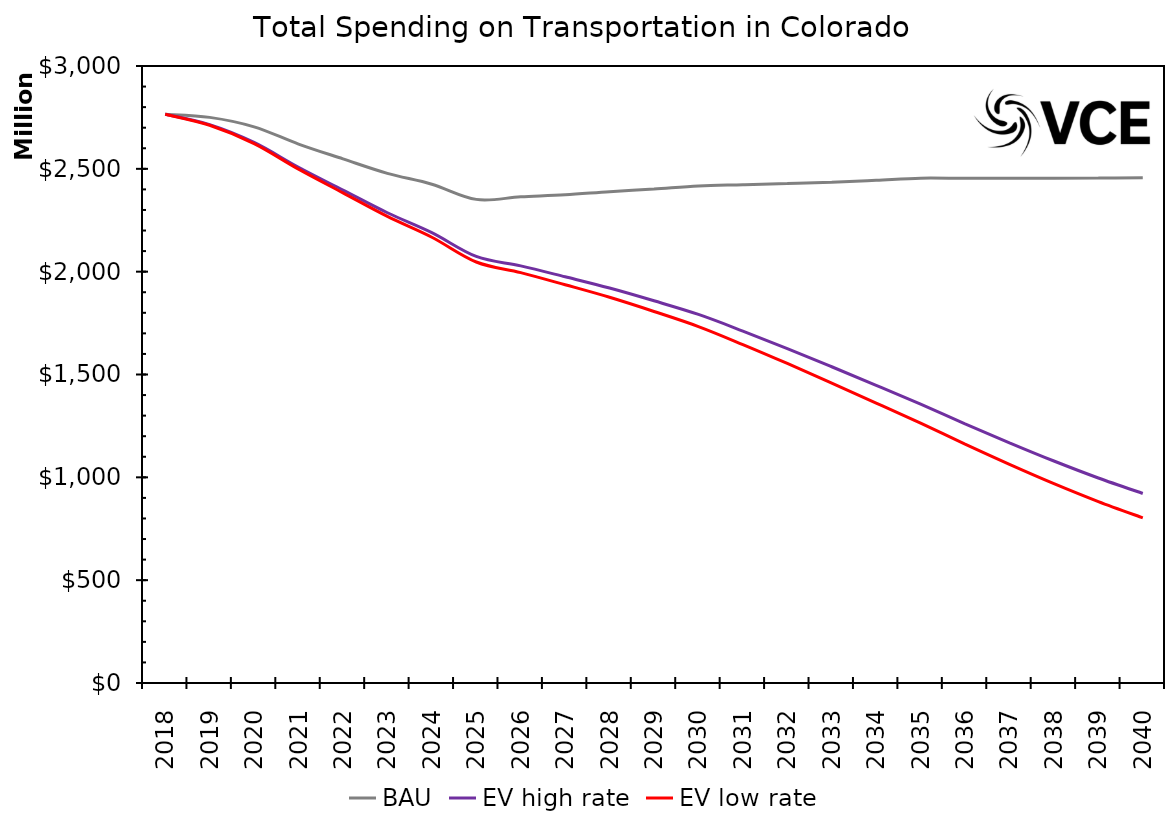
| Category | BAU | EV high rate | EV low rate |
|---|---|---|---|
| 2018.0 | 2765250362.663 | 2765250362.663 | 2765250362.663 |
| 2019.0 | 2750272408.615 | 2714636435.407 | 2711721787.394 |
| 2020.0 | 2704291286.397 | 2628346325.779 | 2622690367.996 |
| 2021.0 | 2620500675.747 | 2507671663.166 | 2498279673.252 |
| 2022.0 | 2548352046.092 | 2396771811.475 | 2383384365.905 |
| 2023.0 | 2478167941.788 | 2286410421.491 | 2268752008.475 |
| 2024.0 | 2425256213.995 | 2189730988.42 | 2167526340.012 |
| 2025.0 | 2351505568.456 | 2074051672.484 | 2047003500.265 |
| 2026.0 | 2363719296.606 | 2028119452.76 | 1995514721.32 |
| 2027.0 | 2373691990.054 | 1975027224.275 | 1936434590.139 |
| 2028.0 | 2389031836.14 | 1920352768.202 | 1875350186.614 |
| 2029.0 | 2401939986.34 | 1858293624.593 | 1806473117.864 |
| 2030.0 | 2416860657.137 | 1792099403.775 | 1733085909.47 |
| 2031.0 | 2422537304.075 | 1711354698.909 | 1645625336.034 |
| 2032.0 | 2428510248.877 | 1626222525.682 | 1553679380.517 |
| 2033.0 | 2435119737.876 | 1537642482.244 | 1458271535.591 |
| 2034.0 | 2444513480.462 | 1447466546.188 | 1361351796.345 |
| 2035.0 | 2454711420.683 | 1355848304.595 | 1263182216.133 |
| 2036.0 | 2453698250.145 | 1260485585.888 | 1161575432 |
| 2037.0 | 2454035579.164 | 1167985699.676 | 1063261220.166 |
| 2038.0 | 2454023688.449 | 1079489890.796 | 969495735.472 |
| 2039.0 | 2454991801.333 | 996915261.1 | 882299012.184 |
| 2040.0 | 2456756119.165 | 921591688.748 | 803082527.856 |